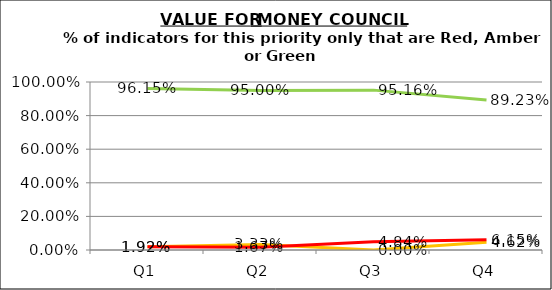
| Category | Green | Amber | Red |
|---|---|---|---|
| Q1 | 0.962 | 0.019 | 0.019 |
| Q2 | 0.95 | 0.033 | 0.017 |
| Q3 | 0.952 | 0 | 0.048 |
| Q4 | 0.892 | 0.046 | 0.062 |